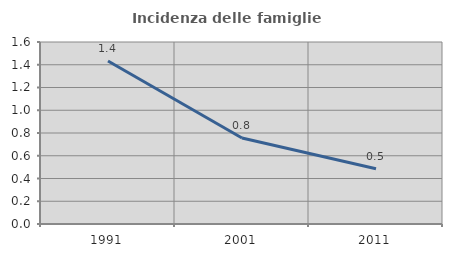
| Category | Incidenza delle famiglie numerose |
|---|---|
| 1991.0 | 1.434 |
| 2001.0 | 0.756 |
| 2011.0 | 0.486 |